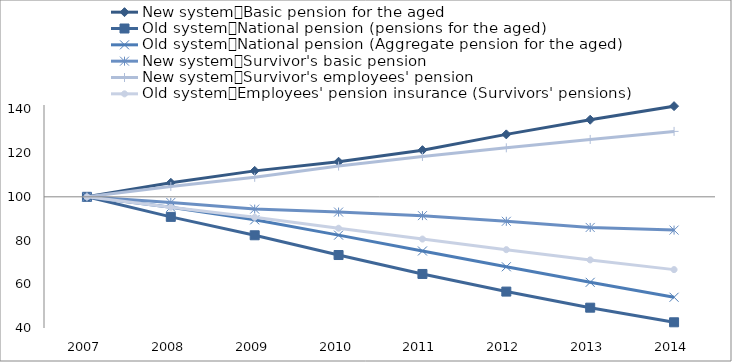
| Category | New system：Basic pension for the aged | Old system：National pension (pensions for the aged) | Old system：National pension (Aggregate pension for the aged) | New system：Survivor's basic pension | New system：Survivor's employees' pension | Old system：Employees' pension insurance (Survivors' pensions) |
|---|---|---|---|---|---|---|
| 2007.0 | 100 | 100 | 100 | 100 | 100 | 100 |
| 2008.0 | 106.411 | 90.827 | 95.245 | 97.417 | 104.771 | 95.189 |
| 2009.0 | 111.866 | 82.412 | 89.468 | 94.384 | 108.924 | 90.636 |
| 2010.0 | 116.047 | 73.376 | 82.473 | 93.024 | 114.069 | 85.621 |
| 2011.0 | 121.332 | 64.718 | 75.232 | 91.396 | 118.452 | 80.68 |
| 2012.0 | 128.568 | 56.653 | 67.999 | 88.806 | 122.414 | 75.832 |
| 2013.0 | 135.271 | 49.296 | 60.897 | 85.995 | 126.244 | 71.148 |
| 2014.0 | 141.476 | 42.61 | 54.063 | 84.781 | 129.925 | 66.703 |